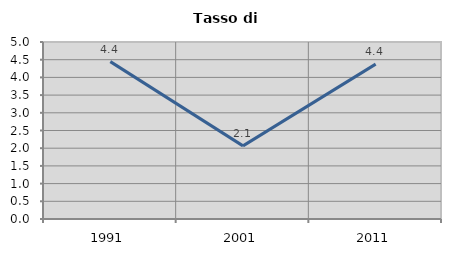
| Category | Tasso di disoccupazione   |
|---|---|
| 1991.0 | 4.446 |
| 2001.0 | 2.066 |
| 2011.0 | 4.374 |